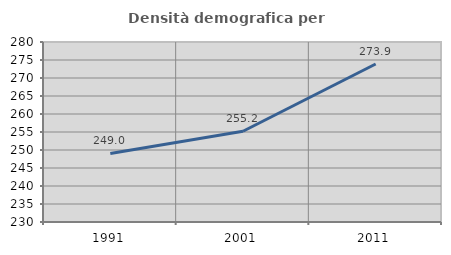
| Category | Densità demografica |
|---|---|
| 1991.0 | 249.047 |
| 2001.0 | 255.217 |
| 2011.0 | 273.888 |